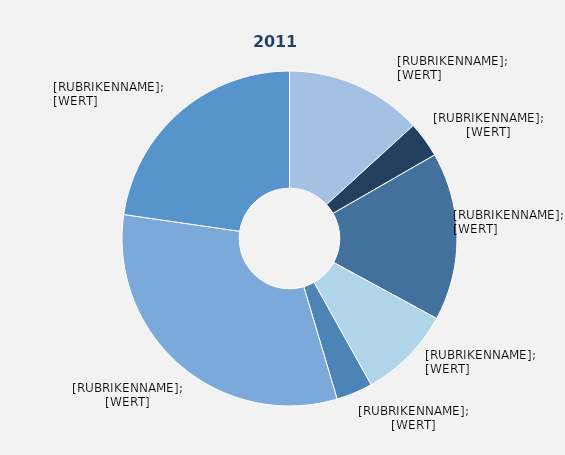
| Category | Series 1 |
|---|---|
| Produzierendes Gewerbe² ohne Baugewerbe | 13.224 |
| Baugewerbe | 3.464 |
| Handel | 16.236 |
| Verkehr und Lagerei | 8.978 |
| Gastgewerbe | 3.51 |
| Erbringung von Unternehmensdienstleistungen | 31.874 |
| Erbringung von öffentlichen und privaten Dienstleistungen | 22.712 |